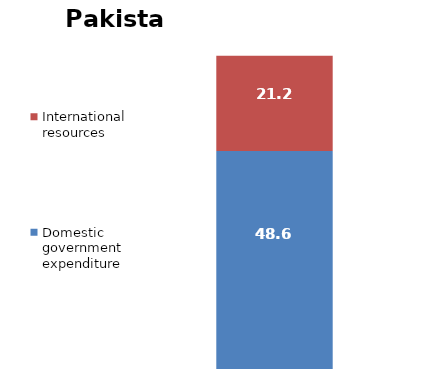
| Category | Domestic government expenditure | International resources |
|---|---|---|
| 0 | 48.572 | 21.235 |